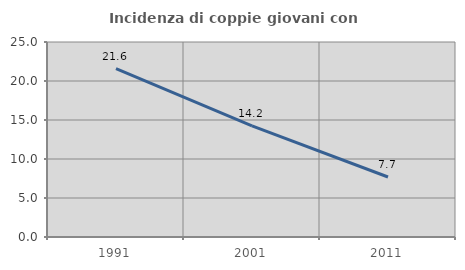
| Category | Incidenza di coppie giovani con figli |
|---|---|
| 1991.0 | 21.584 |
| 2001.0 | 14.237 |
| 2011.0 | 7.692 |